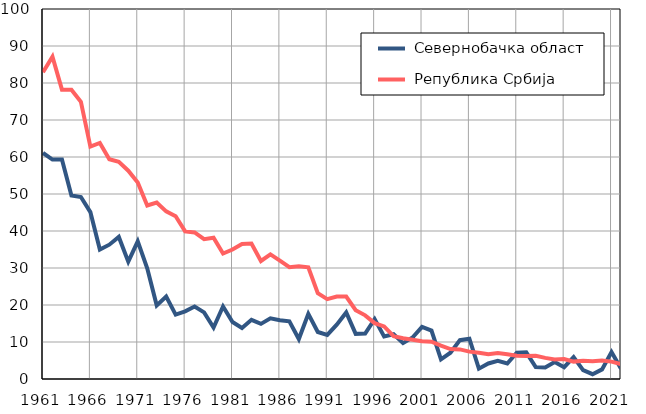
| Category |  Севернобачка област |  Република Србија |
|---|---|---|
| 1961.0 | 61.1 | 82.9 |
| 1962.0 | 59.3 | 87.1 |
| 1963.0 | 59.3 | 78.2 |
| 1964.0 | 49.6 | 78.2 |
| 1965.0 | 49.2 | 74.9 |
| 1966.0 | 45.1 | 62.8 |
| 1967.0 | 35 | 63.8 |
| 1968.0 | 36.3 | 59.4 |
| 1969.0 | 38.4 | 58.7 |
| 1970.0 | 31.7 | 56.3 |
| 1971.0 | 37.2 | 53.1 |
| 1972.0 | 29.9 | 46.9 |
| 1973.0 | 19.9 | 47.7 |
| 1974.0 | 22.3 | 45.3 |
| 1975.0 | 17.4 | 44 |
| 1976.0 | 18.3 | 39.9 |
| 1977.0 | 19.6 | 39.6 |
| 1978.0 | 18 | 37.8 |
| 1979.0 | 13.9 | 38.2 |
| 1980.0 | 19.6 | 33.9 |
| 1981.0 | 15.4 | 35 |
| 1982.0 | 13.8 | 36.5 |
| 1983.0 | 16 | 36.6 |
| 1984.0 | 14.9 | 31.9 |
| 1985.0 | 16.4 | 33.7 |
| 1986.0 | 15.9 | 32 |
| 1987.0 | 15.6 | 30.2 |
| 1988.0 | 10.8 | 30.5 |
| 1989.0 | 17.6 | 30.2 |
| 1990.0 | 12.7 | 23.2 |
| 1991.0 | 11.9 | 21.6 |
| 1992.0 | 14.7 | 22.3 |
| 1993.0 | 18 | 22.3 |
| 1994.0 | 12.2 | 18.6 |
| 1995.0 | 12.3 | 17.2 |
| 1996.0 | 16.2 | 15.1 |
| 1997.0 | 11.5 | 14.2 |
| 1998.0 | 12.1 | 11.6 |
| 1999.0 | 9.7 | 11 |
| 2000.0 | 11.2 | 10.6 |
| 2001.0 | 14.1 | 10.2 |
| 2002.0 | 13.1 | 10.1 |
| 2003.0 | 5.3 | 9 |
| 2004.0 | 7.1 | 8.1 |
| 2005.0 | 10.5 | 8 |
| 2006.0 | 10.9 | 7.4 |
| 2007.0 | 2.8 | 7.1 |
| 2008.0 | 4.2 | 6.7 |
| 2009.0 | 4.9 | 7 |
| 2010.0 | 4.2 | 6.7 |
| 2011.0 | 7.1 | 6.3 |
| 2012.0 | 7.2 | 6.2 |
| 2013.0 | 3.2 | 6.3 |
| 2014.0 | 3.1 | 5.7 |
| 2015.0 | 4.6 | 5.3 |
| 2016.0 | 3.2 | 5.4 |
| 2017.0 | 5.9 | 4.7 |
| 2018.0 | 2.4 | 4.9 |
| 2019.0 | 1.3 | 4.8 |
| 2020.0 | 2.6 | 5 |
| 2021.0 | 7.3 | 4.7 |
| 2022.0 | 2.8 | 4 |